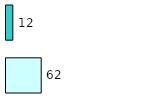
| Category | Series 0 | Series 1 |
|---|---|---|
| 0 | 62 | 12 |